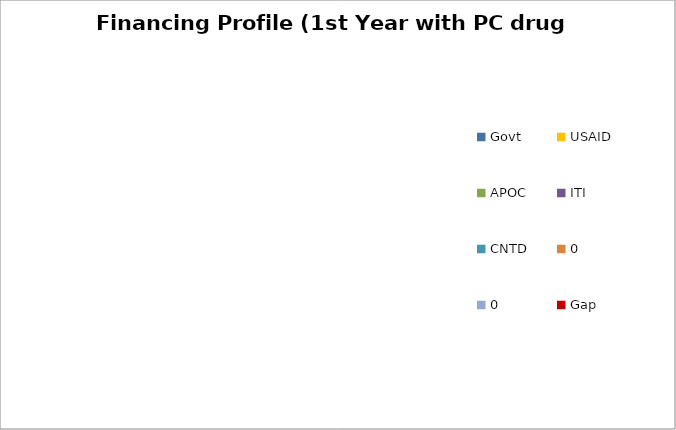
| Category | Series 0 |
|---|---|
| Govt | 0 |
| USAID | 0 |
| APOC | 0 |
| ITI | 0 |
| CNTD | 0 |
| 0 | 0 |
| 0 | 0 |
| Gap | 0 |